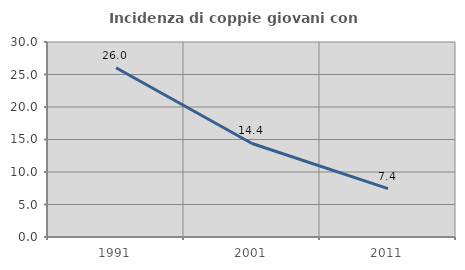
| Category | Incidenza di coppie giovani con figli |
|---|---|
| 1991.0 | 26.034 |
| 2001.0 | 14.39 |
| 2011.0 | 7.433 |